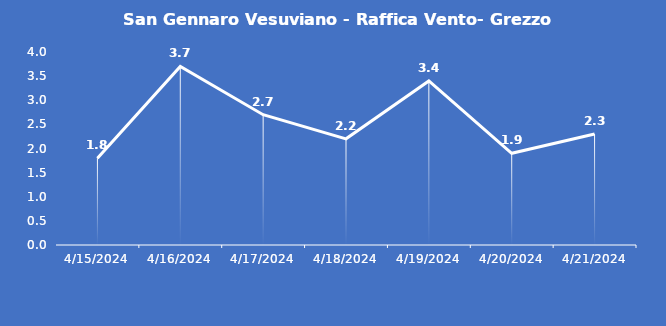
| Category | San Gennaro Vesuviano - Raffica Vento- Grezzo (m/s) |
|---|---|
| 4/15/24 | 1.8 |
| 4/16/24 | 3.7 |
| 4/17/24 | 2.7 |
| 4/18/24 | 2.2 |
| 4/19/24 | 3.4 |
| 4/20/24 | 1.9 |
| 4/21/24 | 2.3 |